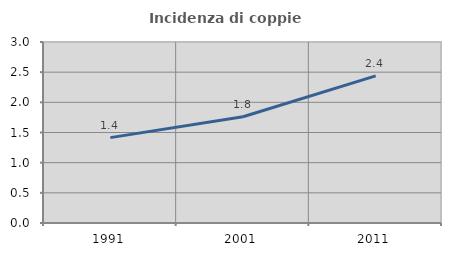
| Category | Incidenza di coppie miste |
|---|---|
| 1991.0 | 1.415 |
| 2001.0 | 1.761 |
| 2011.0 | 2.439 |